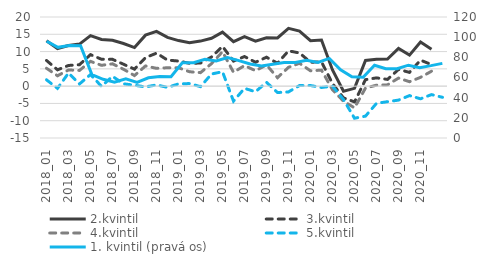
| Category | 2.kvintil | 3.kvintil | 4.kvintil | 5.kvintil |
|---|---|---|---|---|
| 2018_01 | 13.118 | 7.428 | 5.175 | 1.826 |
| 2018_02 | 10.882 | 4.72 | 2.997 | -0.639 |
| 2018_03 | 11.733 | 5.979 | 4.672 | 3.785 |
| 2018_04 | 12.163 | 6.206 | 4.549 | 0.637 |
| 2018_05 | 14.62 | 9.114 | 7.164 | 3.347 |
| 2018_06 | 13.516 | 7.777 | 6.027 | -0.053 |
| 2018_07 | 13.253 | 7.757 | 6.454 | 2.833 |
| 2018_08 | 12.338 | 6.338 | 4.883 | 0.678 |
| 2018_09 | 11.165 | 4.913 | 3.063 | 0.264 |
| 2018_10 | 14.754 | 8.25 | 5.84 | -0.223 |
| 2018_11 | 15.853 | 9.543 | 5.15 | 0.357 |
| 2018_12 | 14.103 | 7.536 | 5.319 | -0.363 |
| 2019_01 | 13.176 | 7.256 | 5.324 | 0.655 |
| 2019_02 | 12.528 | 6.608 | 4.167 | 0.745 |
| 2019_03 | 13.028 | 6.679 | 3.907 | -0.144 |
| 2019_04 | 13.85 | 8.43 | 6.504 | 3.515 |
| 2019_05 | 15.616 | 11.503 | 9.965 | 4.162 |
| 2019_06 | 12.864 | 7.245 | 4.014 | -4.33 |
| 2019_07 | 14.311 | 8.568 | 5.934 | -0.642 |
| 2019_08 | 13.034 | 6.907 | 4.474 | -1.619 |
| 2019_09 | 14.013 | 8.369 | 6.135 | 1.107 |
| 2019_10 | 13.958 | 6.636 | 2.448 | -1.85 |
| 2019_11 | 16.713 | 10.207 | 5.45 | -1.667 |
| 2019_12 | 15.917 | 9.599 | 6.62 | 0.176 |
| 2020_01 | 13.145 | 6.911 | 4.429 | 0.176 |
| 2020_02 | 13.349 | 7.028 | 4.633 | -0.388 |
| 2020_03 | 4.694 | 0.749 | -1.05 | -0.01 |
| 2020_04 | -1.446 | -3.414 | -4.358 | -3.88 |
| 2020_05 | -0.637 | -4.552 | -6.268 | -9.285 |
| 2020_06 | 7.417 | 1.874 | -0.555 | -8.673 |
| 2020_07 | 7.754 | 2.392 | 0.286 | -4.98 |
| 2020_08 | 7.849 | 1.949 | 0.372 | -4.492 |
| 2020_09 | 10.89 | 4.829 | 2.328 | -4.038 |
| 2020_10 | 8.978 | 3.981 | 1.275 | -2.732 |
| 2020_11 | 12.765 | 7.517 | 2.542 | -3.664 |
| 2020_12 | 10.637 | 6.229 | 4.314 | -2.447 |